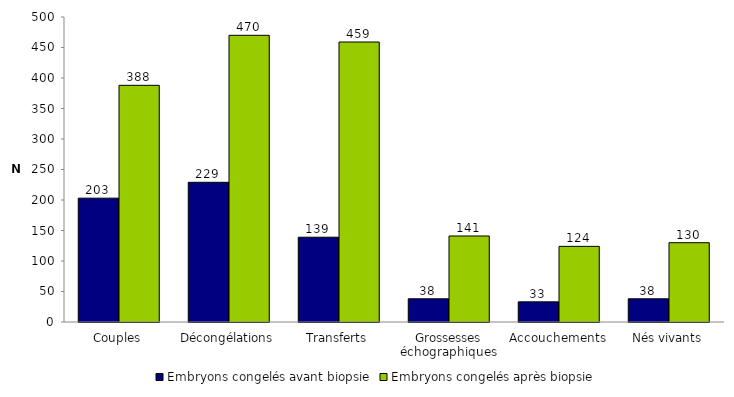
| Category | Embryons congelés avant biopsie | Embryons congelés après biopsie |
|---|---|---|
| Couples | 203 | 388 |
| Décongélations | 229 | 470 |
| Transferts | 139 | 459 |
| Grossesses échographiques | 38 | 141 |
| Accouchements | 33 | 124 |
| Nés vivants | 38 | 130 |